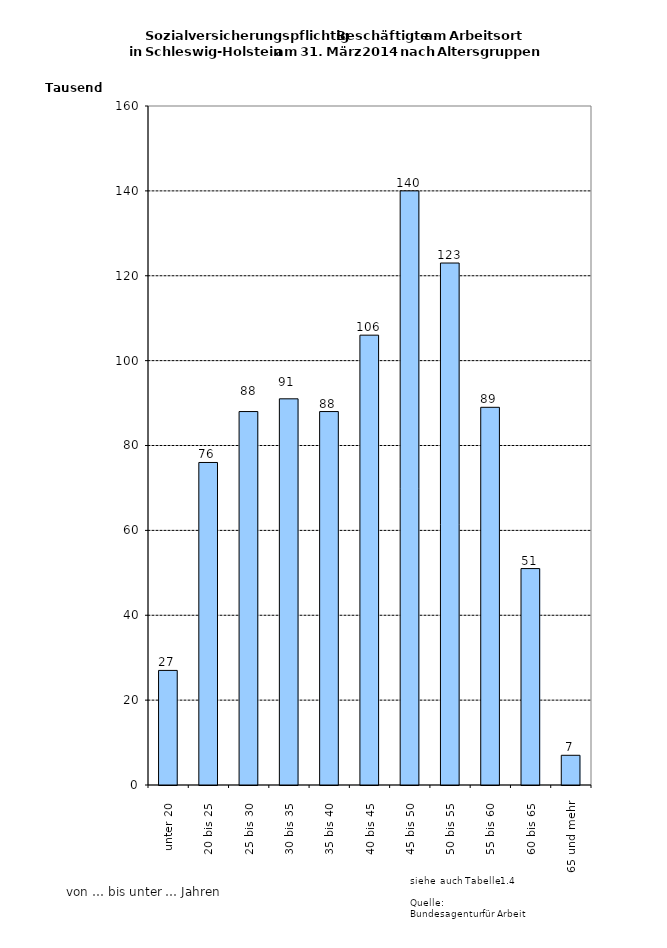
| Category | Series 0 |
|---|---|
| unter 20 | 27000 |
| 20 bis 25 | 76000 |
| 25 bis 30 | 88000 |
| 30 bis 35 | 91000 |
| 35 bis 40 | 88000 |
| 40 bis 45 | 106000 |
| 45 bis 50 | 140000 |
| 50 bis 55 | 123000 |
| 55 bis 60 | 89000 |
| 60 bis 65 | 51000 |
| 65 und mehr | 7000 |